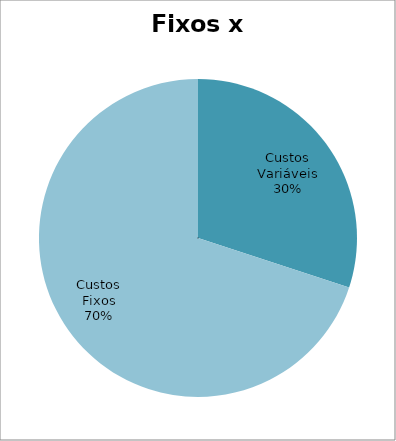
| Category | Series 0 |
|---|---|
| Custos Variáveis | 270.133 |
| Custos Fixos | 629.167 |